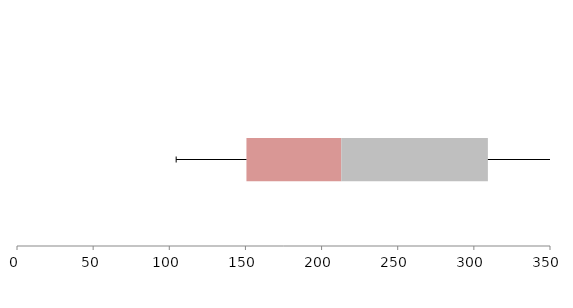
| Category | Series 1 | Series 2 | Series 3 |
|---|---|---|---|
| 0 | 150.668 | 62.285 | 96.26 |